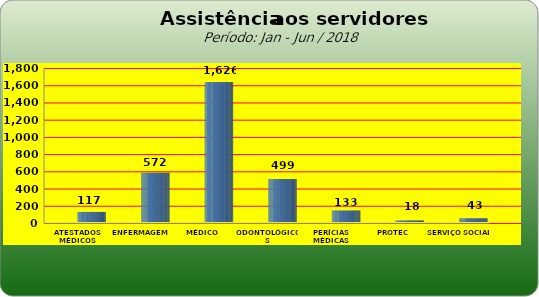
| Category | Series 0 |
|---|---|
| ATESTADOS MÉDICOS | 117 |
| ENFERMAGEM | 572 |
| MÉDICO | 1626 |
| ODONTOLÓGICOS | 499 |
| PERÍCIAS MÉDICAS | 133 |
| PROTEC | 18 |
| SERVIÇO SOCIAL | 43 |